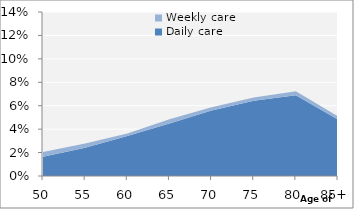
| Category | Daily care | Weekly care |
|---|---|---|
| 50 | 0.016 | 0.004 |
| 55 | 0.024 | 0.004 |
| 60 | 0.034 | 0.002 |
| 65 | 0.045 | 0.004 |
| 70 | 0.056 | 0.003 |
| 75 | 0.064 | 0.003 |
| 80 | 0.069 | 0.004 |
| 85+ | 0.048 | 0.003 |